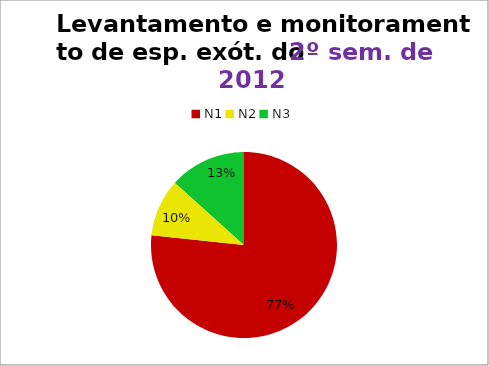
| Category | 2º/12 |
|---|---|
| N1 | 23 |
| N2 | 3 |
| N3 | 4 |